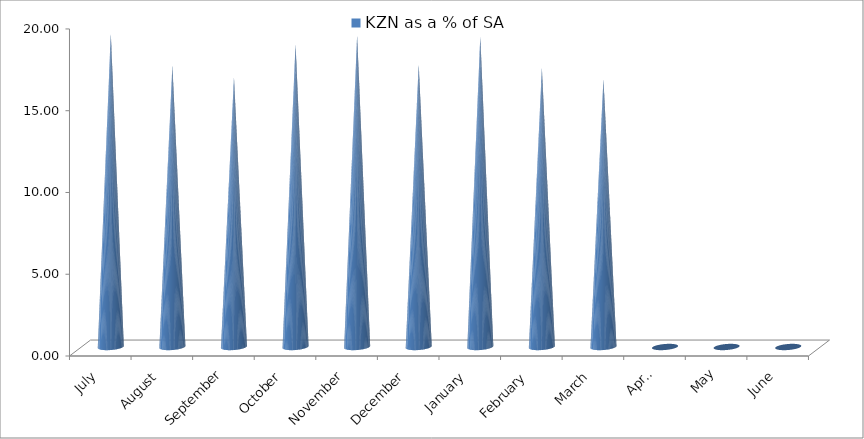
| Category | KZN as a % of SA |
|---|---|
| July | 19.137 |
| August | 17.195 |
| September | 16.466 |
| October | 18.516 |
| November | 19.054 |
| December | 17.253 |
| January | 18.976 |
| February | 17.055 |
| March | 16.377 |
| April | 0 |
| May | 0 |
| June | 0 |